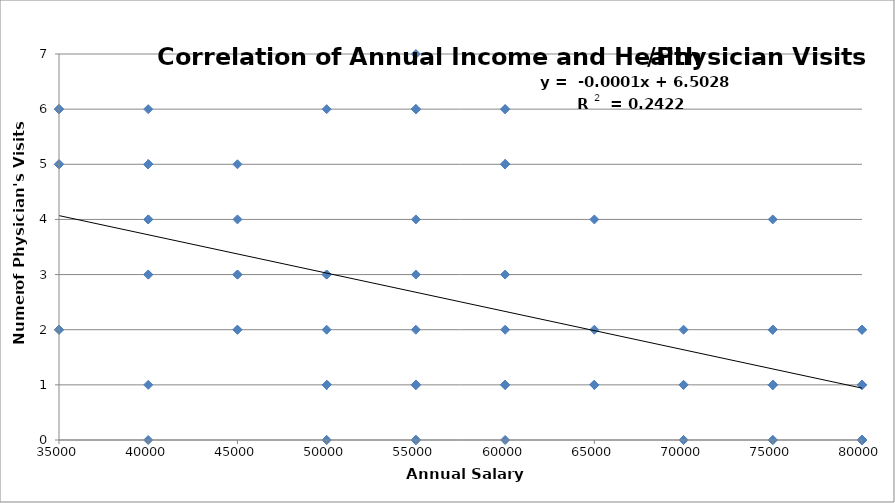
| Category |  Correlation of Income and Health Disparities |
|---|---|
| 45000.0 | 3 |
| 55000.0 | 1 |
| 70000.0 | 0 |
| 55000.0 | 1 |
| 80000.0 | 1 |
| 55000.0 | 1 |
| 75000.0 | 0 |
| 60000.0 | 5 |
| 75000.0 | 1 |
| 35000.0 | 5 |
| 70000.0 | 1 |
| 60000.0 | 5 |
| 75000.0 | 1 |
| 75000.0 | 1 |
| 50000.0 | 1 |
| 40000.0 | 3 |
| 75000.0 | 1 |
| 50000.0 | 3 |
| 40000.0 | 1 |
| 50000.0 | 6 |
| 55000.0 | 7 |
| 60000.0 | 5 |
| 55000.0 | 4 |
| 80000.0 | 0 |
| 70000.0 | 0 |
| 80000.0 | 1 |
| 75000.0 | 2 |
| 60000.0 | 6 |
| 65000.0 | 4 |
| 50000.0 | 0 |
| 45000.0 | 3 |
| 35000.0 | 6 |
| 80000.0 | 2 |
| 40000.0 | 4 |
| 60000.0 | 6 |
| 40000.0 | 5 |
| 60000.0 | 1 |
| 40000.0 | 4 |
| 80000.0 | 0 |
| 75000.0 | 2 |
| 75000.0 | 1 |
| 55000.0 | 6 |
| 65000.0 | 2 |
| 80000.0 | 0 |
| 50000.0 | 1 |
| 45000.0 | 2 |
| 60000.0 | 0 |
| 40000.0 | 5 |
| 75000.0 | 2 |
| 55000.0 | 0 |
| 55000.0 | 2 |
| 75000.0 | 1 |
| 50000.0 | 0 |
| 35000.0 | 2 |
| 60000.0 | 5 |
| 80000.0 | 0 |
| 60000.0 | 1 |
| 65000.0 | 1 |
| 50000.0 | 2 |
| 80000.0 | 2 |
| 55000.0 | 1 |
| 35000.0 | 2 |
| 50000.0 | 1 |
| 80000.0 | 1 |
| 75000.0 | 1 |
| 55000.0 | 0 |
| 50000.0 | 3 |
| 70000.0 | 2 |
| 45000.0 | 4 |
| 50000.0 | 1 |
| 75000.0 | 1 |
| 75000.0 | 0 |
| 55000.0 | 6 |
| 75000.0 | 4 |
| 70000.0 | 1 |
| 60000.0 | 1 |
| 35000.0 | 5 |
| 35000.0 | 2 |
| 40000.0 | 0 |
| 60000.0 | 5 |
| 80000.0 | 2 |
| 55000.0 | 0 |
| 65000.0 | 1 |
| 40000.0 | 5 |
| 60000.0 | 3 |
| 35000.0 | 5 |
| 60000.0 | 2 |
| 45000.0 | 2 |
| 45000.0 | 5 |
| 40000.0 | 3 |
| 80000.0 | 0 |
| 35000.0 | 6 |
| 65000.0 | 1 |
| 60000.0 | 5 |
| 55000.0 | 6 |
| 35000.0 | 6 |
| 40000.0 | 6 |
| 75000.0 | 1 |
| 55000.0 | 3 |
| 40000.0 | 5 |